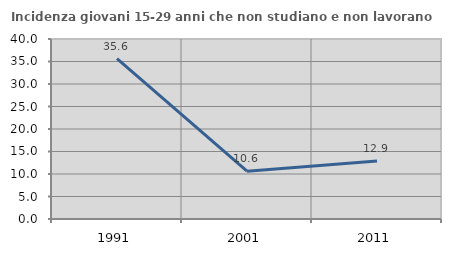
| Category | Incidenza giovani 15-29 anni che non studiano e non lavorano  |
|---|---|
| 1991.0 | 35.646 |
| 2001.0 | 10.623 |
| 2011.0 | 12.891 |